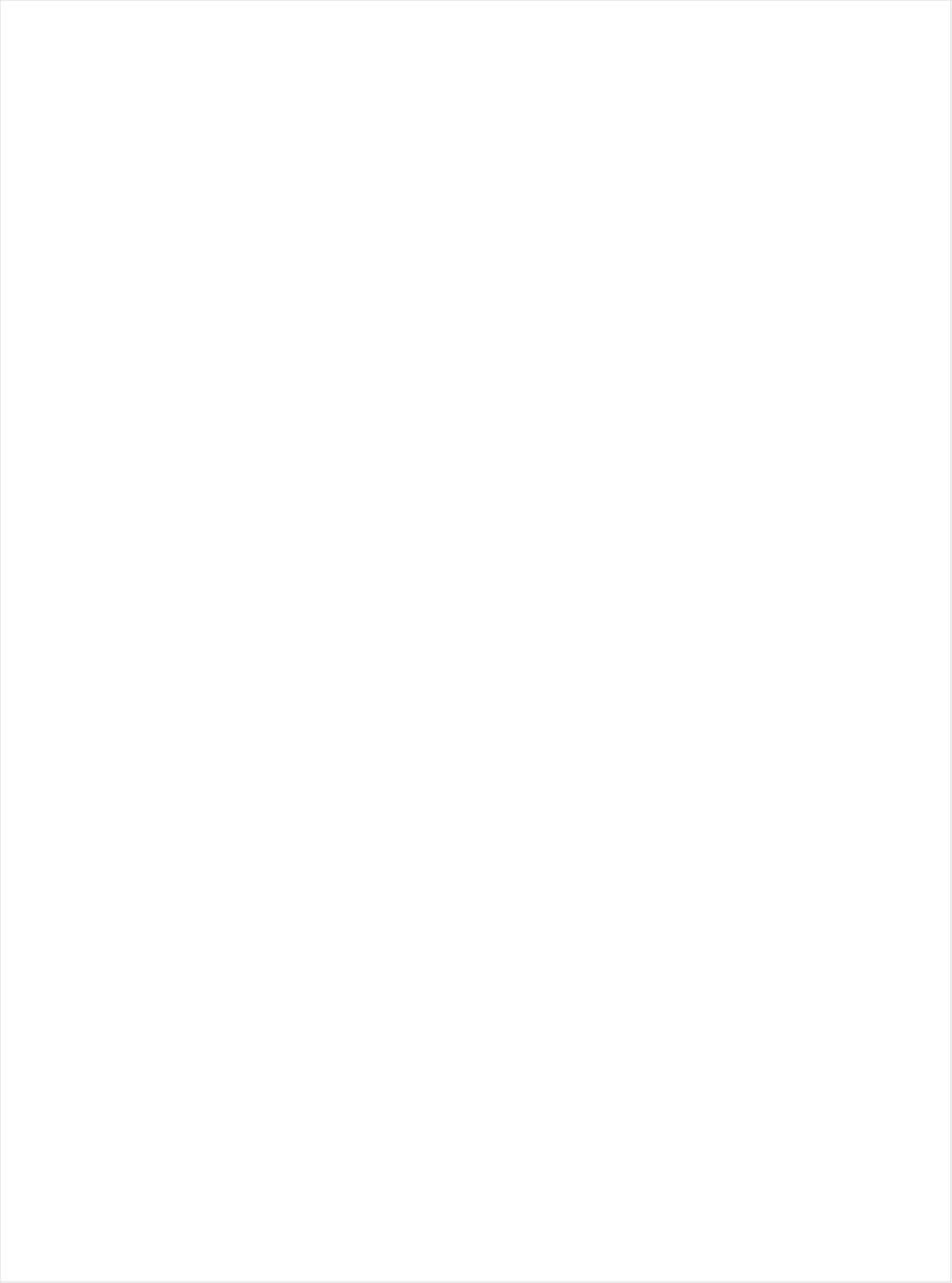
| Category | Total |
|---|---|
| UniMas | -0.691 |
| Telemundo | -0.68 |
| Univision | -0.626 |
| Galavision | -0.61 |
| NBC Universo | -0.601 |
| TUDN | -0.522 |
| Hallmark Movies & Mysteries | -0.279 |
| Discovery Life Channel | -0.247 |
| Hallmark | -0.219 |
| UP TV | -0.213 |
| Nick Toons | -0.17 |
| TLC | -0.166 |
| Lifetime Movies | -0.154 |
| WE TV | -0.134 |
| Nick | -0.133 |
| Disney Channel | -0.13 |
| Disney XD | -0.127 |
| Logo | -0.126 |
| INSP | -0.124 |
| Adult Swim | -0.121 |
| Travel | -0.121 |
| Teen Nick | -0.097 |
| Oprah Winfrey Network | -0.095 |
| Cartoon Network | -0.087 |
| Investigation Discovery | -0.083 |
| E! | -0.058 |
| Nick@Nite | -0.056 |
| OXYGEN | -0.051 |
| VH1 | -0.05 |
| RFD TV | -0.049 |
| Lifetime | -0.041 |
| Headline News | -0.032 |
| ION | -0.028 |
| Nick Jr. | -0.023 |
| CMTV | -0.02 |
| PBS | -0.016 |
| Universal Kids | -0.013 |
| CW | 0.003 |
| TV LAND | 0.009 |
| Ovation | 0.016 |
| BET | 0.017 |
| Disney Junior US | 0.023 |
| Great American Country | 0.025 |
| Science Channel | 0.028 |
| HGTV | 0.031 |
| BRAVO | 0.033 |
| TV ONE | 0.04 |
| MTV2 | 0.04 |
| POP | 0.05 |
| Discovery Family Channel | 0.055 |
| Fox Business | 0.062 |
| WGN America | 0.066 |
| Animal Planet | 0.071 |
| SYFY | 0.071 |
| MSNBC | 0.073 |
| SundanceTV | 0.077 |
| FX | 0.083 |
| A&E | 0.085 |
| BET Her | 0.089 |
| USA Network | 0.095 |
| Reelz Channel | 0.098 |
| CBS | 0.102 |
| Weather Channel | 0.105 |
| History Channel | 0.108 |
| TBS | 0.122 |
| Motor Trend Network | 0.125 |
| MTV | 0.126 |
| ABC | 0.129 |
| FYI | 0.129 |
| Discovery Channel | 0.133 |
| National Geographic Wild | 0.135 |
| Fox News | 0.143 |
| Food Network | 0.144 |
| DIY | 0.146 |
| NBC | 0.148 |
| Game Show | 0.152 |
| Paramount Network | 0.159 |
| FX Movie Channel | 0.164 |
| FXX | 0.164 |
| National Geographic | 0.166 |
| Freeform | 0.173 |
| TNT | 0.179 |
| American Heroes Channel | 0.18 |
| Destination America | 0.19 |
| CNN | 0.192 |
| Smithsonian | 0.198 |
| CNBC | 0.203 |
| FOX | 0.207 |
| truTV | 0.209 |
| Bloomberg HD | 0.218 |
| Cooking Channel | 0.218 |
| Outdoor Channel | 0.23 |
| AMC | 0.232 |
| BBC America | 0.238 |
| Viceland | 0.272 |
| Independent Film (IFC) | 0.284 |
| Comedy Central | 0.293 |
| Tennis Channel | 0.316 |
| The Sportsman Channel | 0.328 |
| Olympic Channel | 0.345 |
| FXDEP | 0.404 |
| MyNetworkTV | 0.508 |
| ESPN Deportes | 0.523 |
| Big Ten Network | 0.525 |
| FOX Sports 2 | 0.561 |
| Fox Sports 1 | 0.573 |
| CBS Sports | 0.591 |
| NHL | 0.647 |
| Golf | 0.649 |
| MLB Network | 0.683 |
| NBA TV | 0.693 |
| ESPNU | 0.722 |
| ESPNEWS | 0.736 |
| PAC-12 Network | 0.751 |
| NBC Sports | 0.769 |
| ESPN2 | 0.783 |
| ESPN | 0.811 |
| NFL Network | 1.016 |